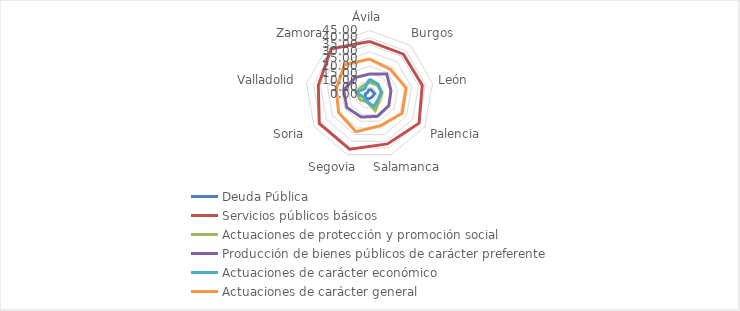
| Category | Deuda Pública | Servicios públicos básicos | Actuaciones de protección y promoción social | Producción de bienes públicos de carácter preferente | Actuaciones de carácter económico | Actuaciones de carácter general |
|---|---|---|---|---|---|---|
| Ávila | 3.941 | 37.312 | 8.629 | 14.355 | 10.86 | 24.904 |
| Burgos | 3.157 | 37.065 | 8.502 | 18.875 | 9.436 | 22.966 |
| León | 3.631 | 37.653 | 8.911 | 15.303 | 8.31 | 26.193 |
| Palencia | 2.557 | 40.261 | 8.023 | 15.707 | 6.948 | 26.504 |
| Salamanca | 2.587 | 36.971 | 11.997 | 16.35 | 8.884 | 23.211 |
| Segovia | 3.479 | 40.874 | 5.475 | 16.903 | 5.421 | 27.849 |
| Soria | 3.602 | 40.797 | 7.603 | 18.348 | 4.518 | 25.132 |
| Valladolid | 2.829 | 36.553 | 9.28 | 18.499 | 9.174 | 23.665 |
| Zamora | 2.067 | 42.011 | 7.735 | 15.588 | 5.258 | 27.34 |